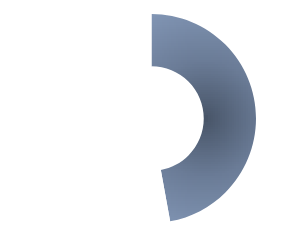
| Category | Series 0 |
|---|---|
| 0 | 2.357 |
| 1 | 2.643 |